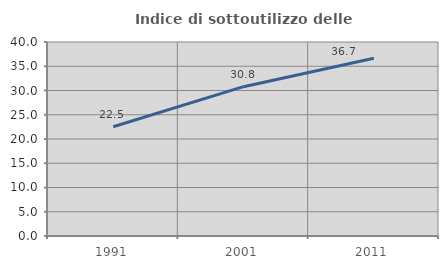
| Category | Indice di sottoutilizzo delle abitazioni  |
|---|---|
| 1991.0 | 22.519 |
| 2001.0 | 30.79 |
| 2011.0 | 36.657 |